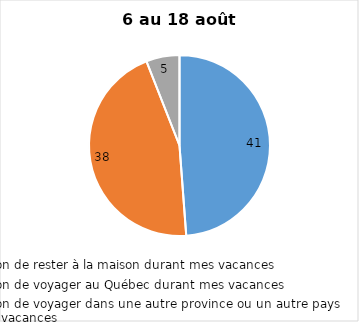
| Category | Series 0 |
|---|---|
| J’ai l’intention de rester à la maison durant mes vacances | 41 |
| J’ai l’intention de voyager au Québec durant mes vacances | 38 |
| J’ai l’intention de voyager dans une autre province ou un autre pays durant mes vacances | 5 |